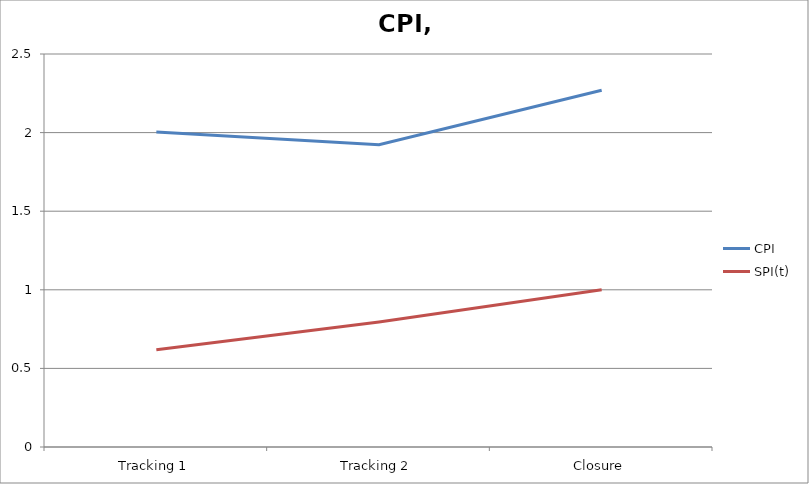
| Category | CPI | SPI(t) |
|---|---|---|
| Tracking 1 | 2.004 | 0.619 |
| Tracking 2 | 1.922 | 0.794 |
| Closure | 2.27 | 1 |